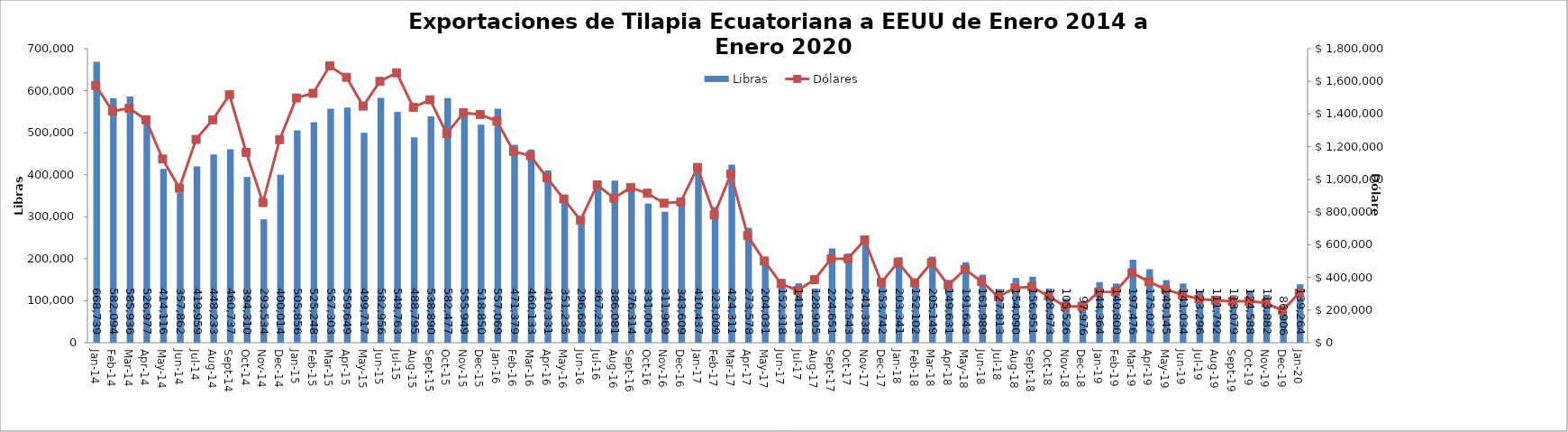
| Category | Libras  |
|---|---|
| 2014-01-01 | 668739 |
| 2014-02-01 | 582093.766 |
| 2014-03-01 | 585936.383 |
| 2014-04-01 | 526976.561 |
| 2014-05-01 | 414116.473 |
| 2014-06-01 | 357861.695 |
| 2014-07-01 | 419958.663 |
| 2014-08-01 | 448233 |
| 2014-09-01 | 460737.149 |
| 2014-10-01 | 394310.347 |
| 2014-11-01 | 293533.672 |
| 2014-12-01 | 400013.647 |
| 2015-01-01 | 505856.493 |
| 2015-02-01 | 525248 |
| 2015-03-01 | 557303.039 |
| 2015-04-01 | 559648.733 |
| 2015-05-01 | 499716.682 |
| 2015-06-01 | 582955.764 |
| 2015-07-01 | 549763.307 |
| 2015-08-01 | 488795.094 |
| 2015-09-01 | 538890.219 |
| 2015-10-01 | 582477.366 |
| 2015-11-01 | 555949.414 |
| 2015-12-01 | 518850.405 |
| 2016-01-01 | 557069.351 |
| 2016-02-01 | 471378.754 |
| 2016-03-01 | 460133.089 |
| 2016-04-01 | 410331.175 |
| 2016-05-01 | 351235 |
| 2016-06-01 | 296682 |
| 2016-07-01 | 367233.45 |
| 2016-08-01 | 386080.575 |
| 2016-09-01 | 376314.197 |
| 2016-10-01 | 331005.258 |
| 2016-11-01 | 311968.537 |
| 2016-12-01 | 343608.956 |
| 2017-01-01 | 410436.996 |
| 2017-02-01 | 323009.174 |
| 2017-03-01 | 424310.544 |
| 2017-04-01 | 273577.632 |
| 2017-05-01 | 204031.321 |
| 2017-06-01 | 152318.019 |
| 2017-07-01 | 141513.274 |
| 2017-08-01 | 128905.167 |
| 2017-09-01 | 224650.945 |
| 2017-10-01 | 212543.281 |
| 2017-11-01 | 241337.562 |
| 2017-12-01 | 153742.19 |
| 2018-01-01 | 203341.281 |
| 2018-02-01 | 152101.968 |
| 2018-03-01 | 205149.053 |
| 2018-04-01 | 149630.611 |
| 2018-05-01 | 191643 |
| 2018-06-01 | 161989 |
| 2018-07-01 | 127813 |
| 2018-08-01 | 154089.894 |
| 2018-09-01 | 156951.494 |
| 2018-10-01 | 128972.628 |
| 2018-11-01 | 105526.466 |
| 2018-12-01 | 97975.634 |
| 2019-01-01 | 144364.157 |
| 2019-02-01 | 140800 |
| 2019-03-01 | 197476 |
| 2019-04-01 | 175027.19 |
| 2019-05-01 | 149144.92 |
| 2019-06-01 | 141034.12 |
| 2019-07-01 | 123295.72 |
| 2019-08-01 | 111792 |
| 2019-09-01 | 113079.347 |
| 2019-10-01 | 124588.429 |
| 2019-11-01 | 113882.151 |
| 2019-12-01 | 86905.72 |
| 2020-01-01 | 139264.124 |